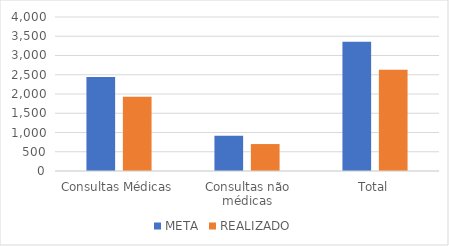
| Category | META | REALIZADO |
|---|---|---|
| Consultas Médicas | 2442 | 1931 |
| Consultas não médicas | 916 | 700 |
| Total | 3358 | 2631 |